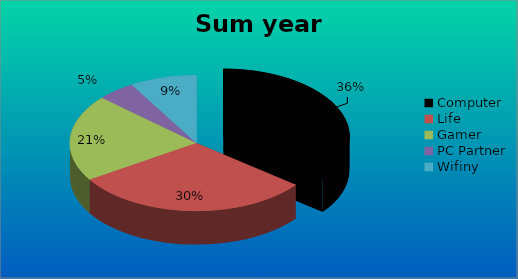
| Category | Sum year 2010 |
|---|---|
| Computer | 14026 |
| Life | 11990 |
| Gamer | 8159 |
| PC Partner | 1913 |
| Wifiny | 3354 |